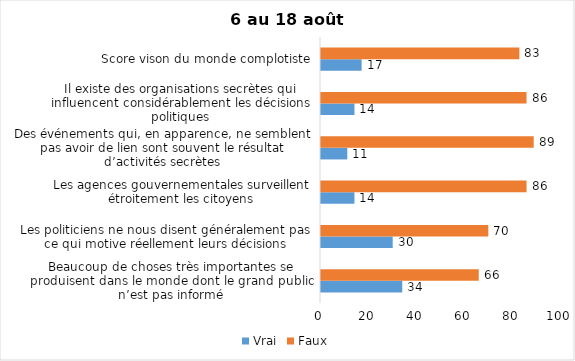
| Category | Vrai | Faux |
|---|---|---|
| Beaucoup de choses très importantes se produisent dans le monde dont le grand public n’est pas informé | 34 | 66 |
| Les politiciens ne nous disent généralement pas ce qui motive réellement leurs décisions | 30 | 70 |
| Les agences gouvernementales surveillent étroitement les citoyens | 14 | 86 |
| Des événements qui, en apparence, ne semblent pas avoir de lien sont souvent le résultat d’activités secrètes | 11 | 89 |
| Il existe des organisations secrètes qui influencent considérablement les décisions politiques | 14 | 86 |
| Score vison du monde complotiste | 17 | 83 |